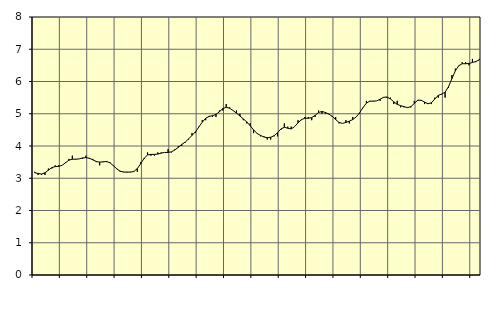
| Category | Piggar | Information och kommunikation, SNI 58-63 |
|---|---|---|
| nan | 3.2 | 3.17 |
| 87.0 | 3.1 | 3.15 |
| 87.0 | 3.1 | 3.13 |
| 87.0 | 3.1 | 3.17 |
| nan | 3.3 | 3.25 |
| 88.0 | 3.3 | 3.33 |
| 88.0 | 3.4 | 3.36 |
| 88.0 | 3.4 | 3.37 |
| nan | 3.4 | 3.4 |
| 89.0 | 3.5 | 3.48 |
| 89.0 | 3.6 | 3.56 |
| 89.0 | 3.7 | 3.59 |
| nan | 3.6 | 3.59 |
| 90.0 | 3.6 | 3.6 |
| 90.0 | 3.6 | 3.63 |
| 90.0 | 3.7 | 3.64 |
| nan | 3.6 | 3.62 |
| 91.0 | 3.6 | 3.57 |
| 91.0 | 3.5 | 3.52 |
| 91.0 | 3.4 | 3.5 |
| nan | 3.5 | 3.51 |
| 92.0 | 3.5 | 3.52 |
| 92.0 | 3.5 | 3.48 |
| 92.0 | 3.4 | 3.39 |
| nan | 3.3 | 3.29 |
| 93.0 | 3.2 | 3.22 |
| 93.0 | 3.2 | 3.19 |
| 93.0 | 3.2 | 3.19 |
| nan | 3.2 | 3.19 |
| 94.0 | 3.2 | 3.21 |
| 94.0 | 3.2 | 3.3 |
| 94.0 | 3.5 | 3.45 |
| nan | 3.6 | 3.62 |
| 95.0 | 3.8 | 3.72 |
| 95.0 | 3.7 | 3.74 |
| 95.0 | 3.7 | 3.74 |
| nan | 3.8 | 3.75 |
| 96.0 | 3.8 | 3.78 |
| 96.0 | 3.8 | 3.8 |
| 96.0 | 3.9 | 3.8 |
| nan | 3.8 | 3.82 |
| 97.0 | 3.9 | 3.88 |
| 97.0 | 4 | 3.96 |
| 97.0 | 4 | 4.05 |
| nan | 4.1 | 4.12 |
| 98.0 | 4.2 | 4.22 |
| 98.0 | 4.4 | 4.33 |
| 98.0 | 4.4 | 4.44 |
| nan | 4.6 | 4.59 |
| 99.0 | 4.8 | 4.74 |
| 99.0 | 4.8 | 4.86 |
| 99.0 | 4.9 | 4.92 |
| nan | 4.9 | 4.94 |
| 0.0 | 4.9 | 4.98 |
| 0.0 | 5.1 | 5.06 |
| 0.0 | 5.1 | 5.16 |
| nan | 5.3 | 5.2 |
| 1.0 | 5.2 | 5.17 |
| 1.0 | 5.1 | 5.1 |
| 1.0 | 5.1 | 5.02 |
| nan | 5 | 4.93 |
| 2.0 | 4.8 | 4.84 |
| 2.0 | 4.7 | 4.75 |
| 2.0 | 4.7 | 4.63 |
| nan | 4.4 | 4.5 |
| 3.0 | 4.4 | 4.39 |
| 3.0 | 4.3 | 4.33 |
| 3.0 | 4.3 | 4.28 |
| nan | 4.2 | 4.26 |
| 4.0 | 4.2 | 4.27 |
| 4.0 | 4.3 | 4.32 |
| 4.0 | 4.3 | 4.41 |
| nan | 4.5 | 4.53 |
| 5.0 | 4.7 | 4.58 |
| 5.0 | 4.6 | 4.55 |
| 5.0 | 4.6 | 4.53 |
| nan | 4.6 | 4.6 |
| 6.0 | 4.8 | 4.72 |
| 6.0 | 4.8 | 4.82 |
| 6.0 | 4.9 | 4.86 |
| nan | 4.9 | 4.86 |
| 7.0 | 4.8 | 4.88 |
| 7.0 | 4.9 | 4.95 |
| 7.0 | 5.1 | 5.04 |
| nan | 5 | 5.07 |
| 8.0 | 5 | 5.04 |
| 8.0 | 5 | 4.99 |
| 8.0 | 4.9 | 4.92 |
| nan | 4.9 | 4.82 |
| 9.0 | 4.7 | 4.73 |
| 9.0 | 4.7 | 4.7 |
| 9.0 | 4.8 | 4.73 |
| nan | 4.7 | 4.77 |
| 10.0 | 4.9 | 4.82 |
| 10.0 | 4.9 | 4.9 |
| 10.0 | 5 | 5.03 |
| nan | 5.2 | 5.19 |
| 11.0 | 5.4 | 5.33 |
| 11.0 | 5.4 | 5.39 |
| 11.0 | 5.4 | 5.39 |
| nan | 5.4 | 5.4 |
| 12.0 | 5.4 | 5.45 |
| 12.0 | 5.5 | 5.51 |
| 12.0 | 5.5 | 5.52 |
| nan | 5.5 | 5.46 |
| 13.0 | 5.3 | 5.37 |
| 13.0 | 5.4 | 5.29 |
| 13.0 | 5.2 | 5.25 |
| nan | 5.2 | 5.22 |
| 14.0 | 5.2 | 5.19 |
| 14.0 | 5.2 | 5.22 |
| 14.0 | 5.4 | 5.32 |
| nan | 5.4 | 5.42 |
| 15.0 | 5.4 | 5.42 |
| 15.0 | 5.3 | 5.36 |
| 15.0 | 5.3 | 5.31 |
| nan | 5.3 | 5.34 |
| 16.0 | 5.5 | 5.46 |
| 16.0 | 5.5 | 5.57 |
| 16.0 | 5.6 | 5.61 |
| nan | 5.5 | 5.67 |
| 17.0 | 5.8 | 5.84 |
| 17.0 | 6.2 | 6.09 |
| 17.0 | 6.4 | 6.33 |
| nan | 6.5 | 6.49 |
| 18.0 | 6.6 | 6.55 |
| 18.0 | 6.6 | 6.55 |
| 18.0 | 6.5 | 6.56 |
| nan | 6.7 | 6.59 |
| 19.0 | 6.6 | 6.62 |
| 19.0 | 6.7 | 6.67 |